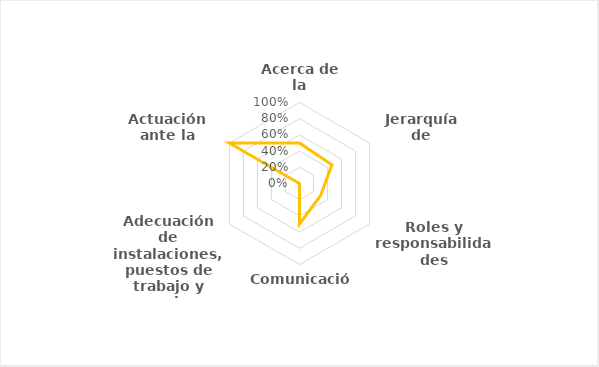
| Category | Series 0 |
|---|---|
| Acerca de la COVID-19 | 0.5 |
| Jerarquía de controles | 0.462 |
| Roles y responsabilidades | 0.3 |
| Comunicación | 0.5 |
| Adecuación de instalaciones, puestos de trabajo y operaciones | 0 |
| Actuación ante la COVID-19 | 1 |